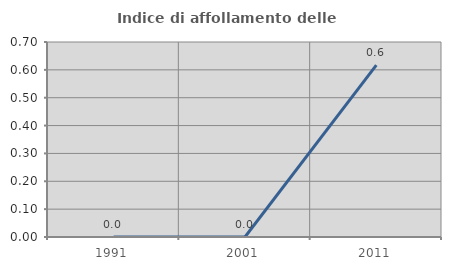
| Category | Indice di affollamento delle abitazioni  |
|---|---|
| 1991.0 | 0 |
| 2001.0 | 0 |
| 2011.0 | 0.617 |